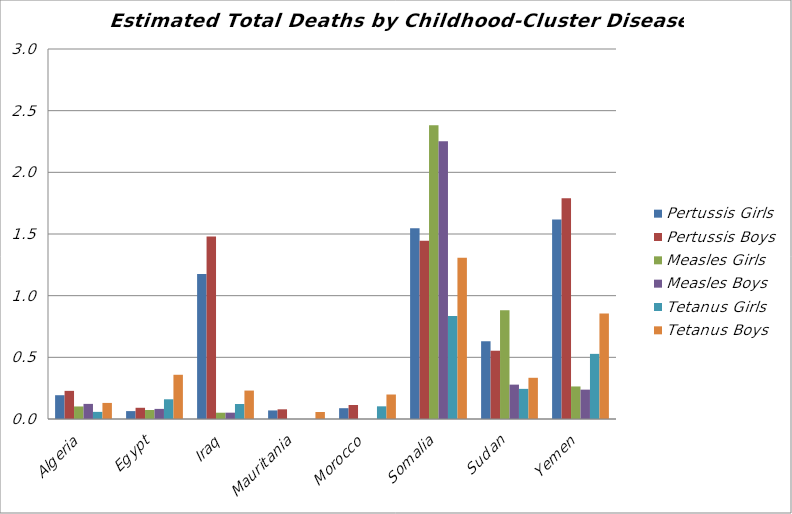
| Category | Pertussis Girls | Pertussis Boys | Measles Girls | Measles Boys | Tetanus Girls | Tetanus Boys |
|---|---|---|---|---|---|---|
| Algeria | 0.193 | 0.228 | 0.102 | 0.123 | 0.058 | 0.13 |
| Egypt | 0.064 | 0.091 | 0.073 | 0.082 | 0.16 | 0.359 |
| Iraq | 1.176 | 1.479 | 0.051 | 0.051 | 0.122 | 0.231 |
| Mauritania | 0.069 | 0.079 | 0 | 0 | 0 | 0.057 |
| Morocco | 0.088 | 0.113 | 0 | 0 | 0.103 | 0.199 |
| Somalia | 1.547 | 1.444 | 2.382 | 2.252 | 0.836 | 1.308 |
| Sudan | 0.63 | 0.554 | 0.882 | 0.279 | 0.244 | 0.334 |
| Yemen | 1.617 | 1.79 | 0.264 | 0.238 | 0.528 | 0.856 |